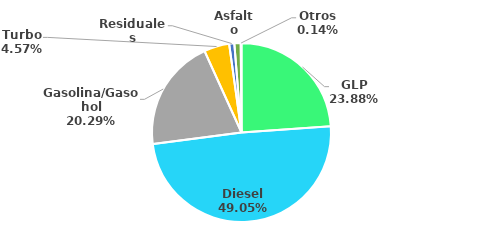
| Category | MBPD |
|---|---|
| GLP | 61.655 |
| Diesel | 126.658 |
| Gasolina/Gasohol | 52.394 |
| Turbo | 11.804 |
| Residuales | 2.389 |
| Asfalto | 2.959 |
| Otros | 0.353 |